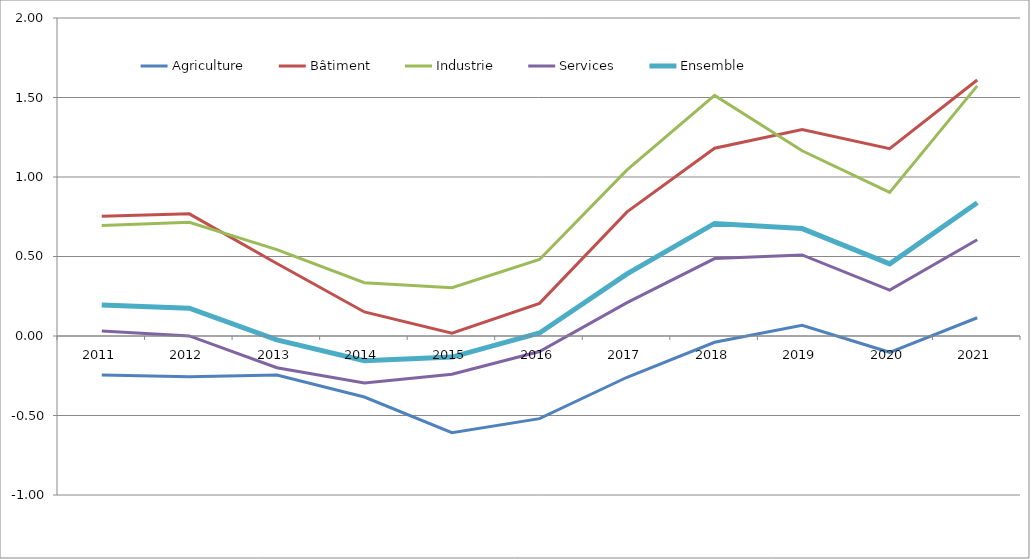
| Category | Agriculture | Bâtiment | Industrie | Services | Ensemble |
|---|---|---|---|---|---|
| 2011 | -0.245 | 0.753 | 0.696 | 0.031 | 0.195 |
| 2012 | -0.256 | 0.768 | 0.715 | 0 | 0.175 |
| 2013 | -0.246 | 0.456 | 0.543 | -0.2 | -0.024 |
| 2014 | -0.384 | 0.151 | 0.335 | -0.296 | -0.155 |
| 2015 | -0.608 | 0.017 | 0.303 | -0.24 | -0.132 |
| 2016 | -0.52 | 0.205 | 0.481 | -0.098 | 0.019 |
| 2017 | -0.26 | 0.781 | 1.044 | 0.21 | 0.391 |
| 2018 | -0.039 | 1.181 | 1.513 | 0.487 | 0.708 |
| 2019 | 0.067 | 1.299 | 1.165 | 0.51 | 0.676 |
| 2020 | -0.102 | 1.178 | 0.903 | 0.289 | 0.454 |
| 2021 | 0.115 | 1.61 | 1.573 | 0.605 | 0.838 |